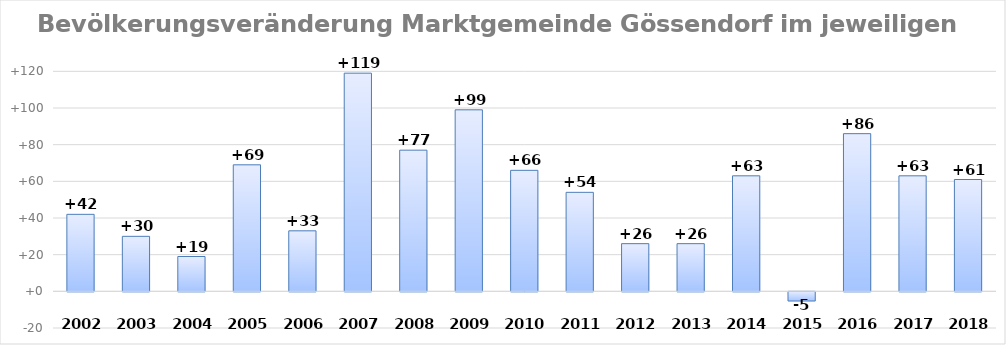
| Category | Series 0 |
|---|---|
| 2002.0 | 42 |
| 2003.0 | 30 |
| 2004.0 | 19 |
| 2005.0 | 69 |
| 2006.0 | 33 |
| 2007.0 | 119 |
| 2008.0 | 77 |
| 2009.0 | 99 |
| 2010.0 | 66 |
| 2011.0 | 54 |
| 2012.0 | 26 |
| 2013.0 | 26 |
| 2014.0 | 63 |
| 2015.0 | -5 |
| 2016.0 | 86 |
| 2017.0 | 63 |
| 2018.0 | 61 |